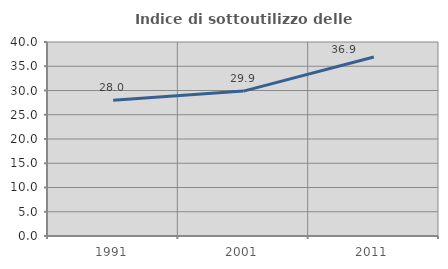
| Category | Indice di sottoutilizzo delle abitazioni  |
|---|---|
| 1991.0 | 27.987 |
| 2001.0 | 29.873 |
| 2011.0 | 36.908 |